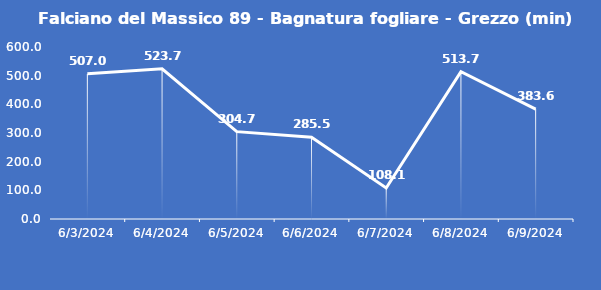
| Category | Falciano del Massico 89 - Bagnatura fogliare - Grezzo (min) |
|---|---|
| 6/3/24 | 507 |
| 6/4/24 | 523.7 |
| 6/5/24 | 304.7 |
| 6/6/24 | 285.5 |
| 6/7/24 | 108.1 |
| 6/8/24 | 513.7 |
| 6/9/24 | 383.6 |